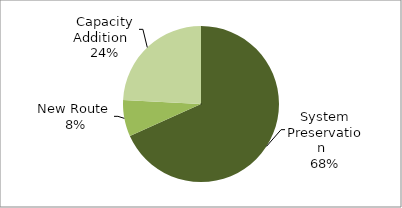
| Category | Series 0 |
|---|---|
| System Preservation   | 0.683 |
| New Route   | 0.075 |
| Capacity Addition   | 0.242 |